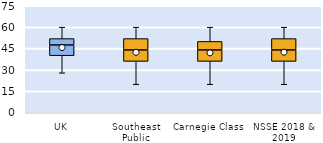
| Category | 25th | 50th | 75th |
|---|---|---|---|
| UK | 40 | 7.5 | 4.5 |
| Southeast Public | 36 | 8 | 8 |
| Carnegie Class | 36 | 8 | 6 |
| NSSE 2018 & 2019 | 36 | 8 | 8 |